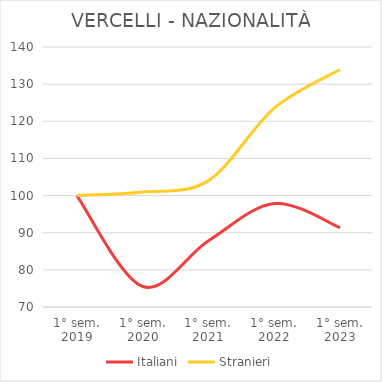
| Category | Italiani | Stranieri |
|---|---|---|
| 1° sem.
2019 | 100 | 100 |
| 1° sem.
2020 | 75.528 | 100.943 |
| 1° sem.
2021 | 87.845 | 104.027 |
| 1° sem.
2022 | 97.856 | 123.565 |
| 1° sem.
2023 | 91.359 | 133.933 |